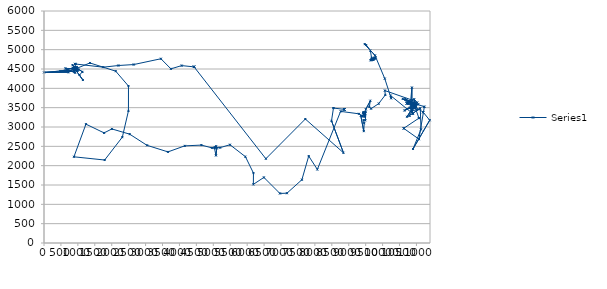
| Category | Series 0 |
|---|---|
| 9722.0 | 4756 |
| 9758.0 | 4790 |
| 9721.0 | 4743 |
| 9707.0 | 4742 |
| 9746.0 | 4770 |
| 9739.0 | 4760 |
| 9733.0 | 4775 |
| 9780.0 | 4781 |
| 9766.0 | 4781 |
| 9794.0 | 4800 |
| 9762.0 | 4770 |
| 9722.0 | 4739 |
| 9644.0 | 4729 |
| 9677.0 | 4746 |
| 9655.0 | 4725 |
| 9675.0 | 4788 |
| 9639.0 | 4975 |
| 9516.0 | 5119 |
| 9472.0 | 5144 |
| 9776.0 | 4851 |
| 10064.0 | 4252 |
| 10253.0 | 3742 |
| 10237.0 | 3813 |
| 10901.0 | 3339 |
| 10812.0 | 3499 |
| 10865.0 | 4020 |
| 10863.0 | 3412 |
| 11018.0 | 3451 |
| 10594.0 | 3727 |
| 10978.0 | 3568 |
| 10902.0 | 3605 |
| 10929.0 | 3487 |
| 10793.0 | 3295 |
| 10793.0 | 3295 |
| 11113.0 | 3484 |
| 11134.0 | 2938 |
| 10898.0 | 2432 |
| 11391.0 | 3175 |
| 11200.0 | 3382 |
| 11200.0 | 3382 |
| 10761.0 | 3647 |
| 10924.0 | 3520 |
| 10721.0 | 3264 |
| 10938.0 | 3561 |
| 11053.0 | 3585 |
| 10644.0 | 3427 |
| 10980.0 | 3604 |
| 11027.0 | 3631 |
| 10935.0 | 3718 |
| 10950.0 | 3646 |
| 10848.0 | 3574 |
| 10715.0 | 3610 |
| 10715.0 | 3610 |
| 10715.0 | 3610 |
| 10760.0 | 3599 |
| 10812.0 | 3667 |
| 10989.0 | 3605 |
| 10989.0 | 3605 |
| 10989.0 | 3605 |
| 10989.0 | 3605 |
| 10989.0 | 3605 |
| 10859.0 | 3460 |
| 10976.0 | 3511 |
| 10976.0 | 3511 |
| 10976.0 | 3511 |
| 10976.0 | 3511 |
| 10668.0 | 3726 |
| 10928.0 | 3617 |
| 11233.0 | 3523 |
| 11233.0 | 3523 |
| 11072.0 | 2687 |
| 11072.0 | 2687 |
| 10623.0 | 2965 |
| 10623.0 | 2965 |
| 11073.0 | 3229 |
| 11073.0 | 3229 |
| 10888.0 | 3691 |
| 10888.0 | 3691 |
| 10065.0 | 3943 |
| 10081.0 | 3830 |
| 9884.0 | 3604 |
| 9659.0 | 3474 |
| 9608.0 | 3519 |
| 9639.0 | 3679 |
| 9503.0 | 3458 |
| 9492.0 | 3174 |
| 9437.0 | 3177 |
| 9457.0 | 3100 |
| 9443.0 | 2893 |
| 9356.0 | 3292 |
| 9396.0 | 3290 |
| 9445.0 | 3326 |
| 9483.0 | 3343 |
| 9431.0 | 3379 |
| 9453.0 | 3384 |
| 9427.0 | 3362 |
| 9442.0 | 3358 |
| 9479.0 | 3351 |
| 9447.0 | 3351 |
| 9475.0 | 3265 |
| 9472.0 | 3300 |
| 9497.0 | 3390 |
| 9468.0 | 3325 |
| 9420.0 | 3270 |
| 9304.0 | 3341 |
| 8760.0 | 3404 |
| 8073.0 | 1902 |
| 7818.0 | 2248 |
| 7616.0 | 1636 |
| 7175.0 | 1288 |
| 6967.0 | 1282 |
| 6494.0 | 1696 |
| 6183.0 | 1516 |
| 6186.0 | 1808 |
| 5949.0 | 2232 |
| 5492.0 | 2541 |
| 5199.0 | 2466 |
| 5071.0 | 2468 |
| 5084.0 | 2504 |
| 5035.0 | 2454 |
| 5078.0 | 2265 |
| 5102.0 | 2449 |
| 5061.0 | 2472 |
| 5045.0 | 2470 |
| 4961.0 | 2460 |
| 4648.0 | 2532 |
| 4156.0 | 2512 |
| 3661.0 | 2356 |
| 3042.0 | 2526 |
| 2529.0 | 2815 |
| 2004.0 | 2950 |
| 1775.0 | 2847 |
| 1239.0 | 3074 |
| 884.0 | 2229 |
| 1791.0 | 2146 |
| 2314.0 | 2738 |
| 2494.0 | 3417 |
| 2495.0 | 4059 |
| 2117.0 | 4444 |
| 1357.0 | 4656 |
| 916.0 | 4498 |
| 842.0 | 4600 |
| 1136.0 | 4426 |
| 1047.0 | 4346 |
| 1148.0 | 4215 |
| 905.0 | 4509 |
| 631.0 | 4515 |
| 919.0 | 4403 |
| 848.0 | 4529 |
| 481.0 | 4441 |
| 896.0 | 4435 |
| 899.0 | 4547 |
| 899.0 | 4473 |
| 891.0 | 4525 |
| 886.0 | 4467 |
| 1020.0 | 4485 |
| 0.0 | 4412 |
| 727.0 | 4415 |
| 934.0 | 4556 |
| 964.0 | 4499 |
| 973.0 | 4549 |
| 917.0 | 4475 |
| 868.0 | 4513 |
| 930.0 | 4511 |
| 910.0 | 4479 |
| 994.0 | 4447 |
| 939.0 | 4456 |
| 921.0 | 4630 |
| 921.0 | 4630 |
| 921.0 | 4630 |
| 921.0 | 4630 |
| 921.0 | 4630 |
| 921.0 | 4630 |
| 921.0 | 4630 |
| 921.0 | 4630 |
| 921.0 | 4630 |
| 921.0 | 4630 |
| 1749.0 | 4547 |
| 2196.0 | 4590 |
| 2649.0 | 4615 |
| 3453.0 | 4765 |
| 3748.0 | 4504 |
| 4065.0 | 4588 |
| 4432.0 | 4555 |
| 4432.0 | 4555 |
| 4432.0 | 4555 |
| 4432.0 | 4555 |
| 4432.0 | 4555 |
| 4432.0 | 4555 |
| 6552.0 | 2179 |
| 7718.0 | 3206 |
| 8844.0 | 2334 |
| 8491.0 | 3159 |
| 8549.0 | 3490 |
| 8549.0 | 3490 |
| 8869.0 | 3456 |
| 8869.0 | 3456 |
| 8869.0 | 3456 |
| 8869.0 | 3456 |
| 8869.0 | 3456 |
| 8869.0 | 3456 |